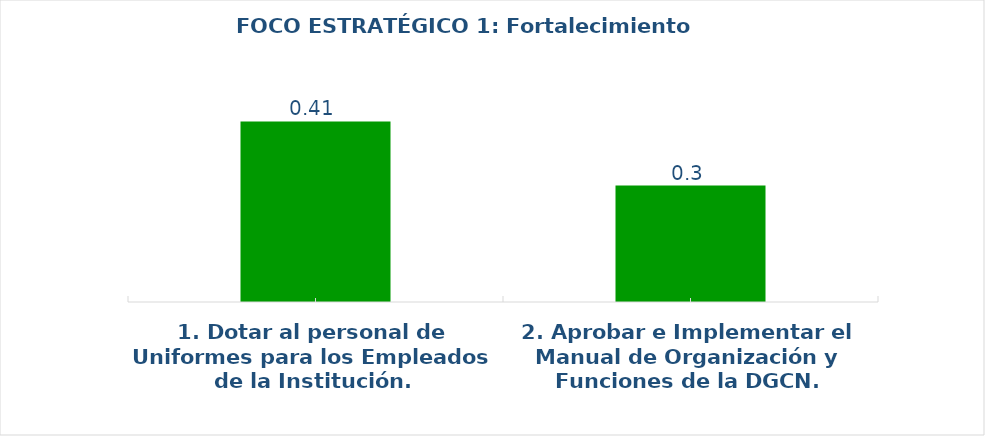
| Category | 1. Dotar al personal de Uniformes para los Empleados de la Institución. |
|---|---|
| 1. Dotar al personal de Uniformes para los Empleados de la Institución. | 0.41 |
| 2. Aprobar e Implementar el Manual de Organización y Funciones de la DGCN. | 0.3 |